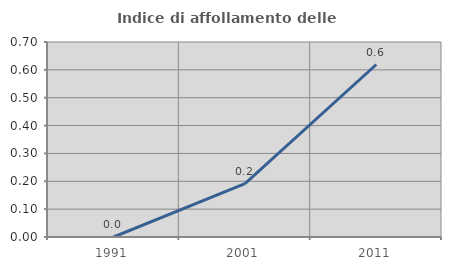
| Category | Indice di affollamento delle abitazioni  |
|---|---|
| 1991.0 | 0 |
| 2001.0 | 0.191 |
| 2011.0 | 0.619 |